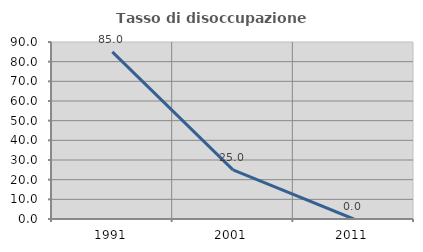
| Category | Tasso di disoccupazione giovanile  |
|---|---|
| 1991.0 | 85 |
| 2001.0 | 25 |
| 2011.0 | 0 |